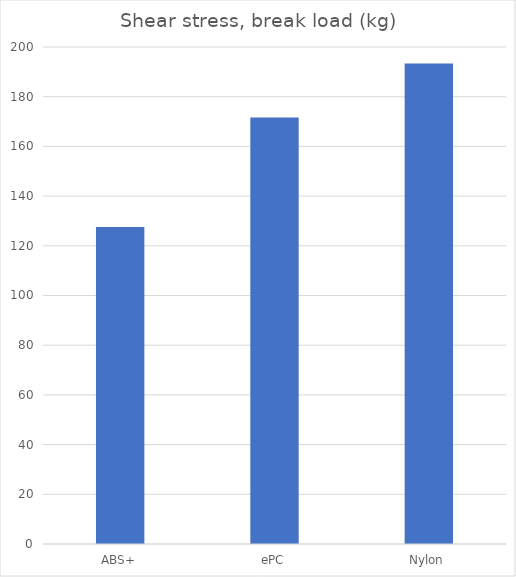
| Category | Break kg |
|---|---|
| ABS+ | 127.6 |
| ePC | 171.6 |
| Nylon | 193.4 |